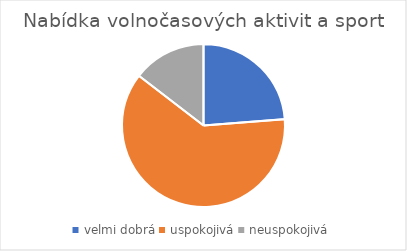
| Category | Nabídka volnočasových aktivit a sport |
|---|---|
| velmi dobrá | 62 |
| uspokojivá | 161 |
| neuspokojivá | 38 |